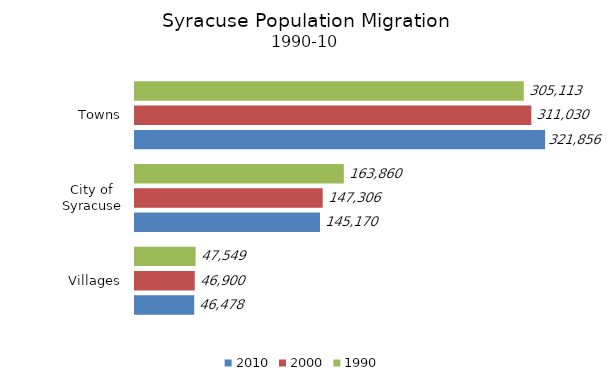
| Category | 2010 | 2000 | 1990 |
|---|---|---|---|
| Villages | 46478 | 46900 | 47549 |
| City of Syracuse | 145170 | 147306 | 163860 |
| Towns | 321856 | 311030 | 305113 |